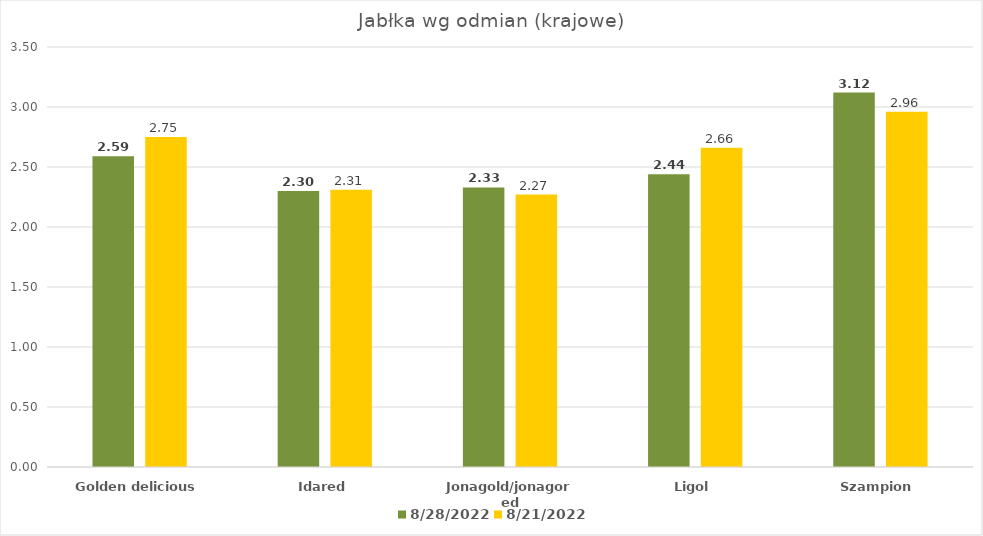
| Category | 28.08.2022 | 21.08.2022 |
|---|---|---|
| Golden delicious | 2.59 | 2.75 |
| Idared | 2.3 | 2.31 |
| Jonagold/jonagored | 2.33 | 2.27 |
| Ligol | 2.44 | 2.66 |
| Szampion | 3.12 | 2.96 |